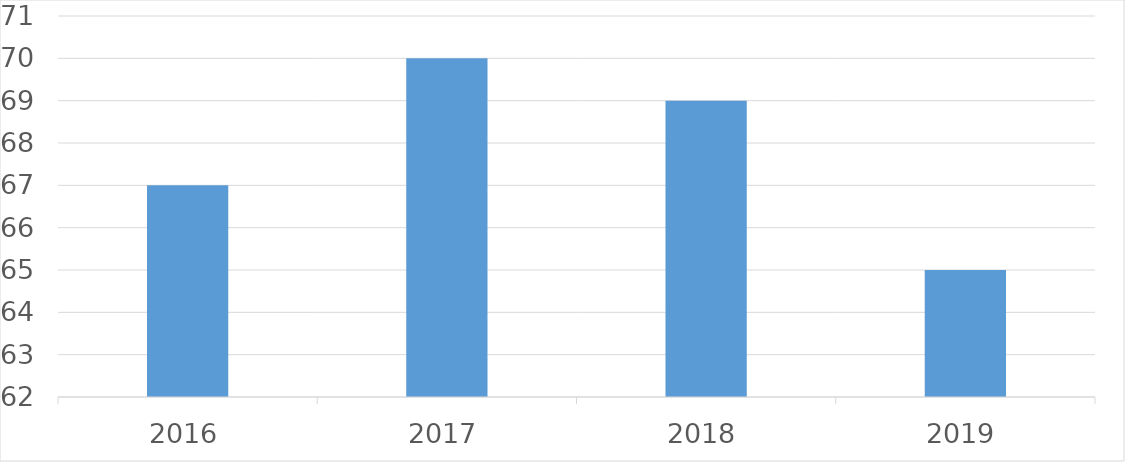
| Category | Series 0 |
|---|---|
| 2016 | 67 |
| 2017 | 70 |
| 2018 | 69 |
| 2019 | 65 |